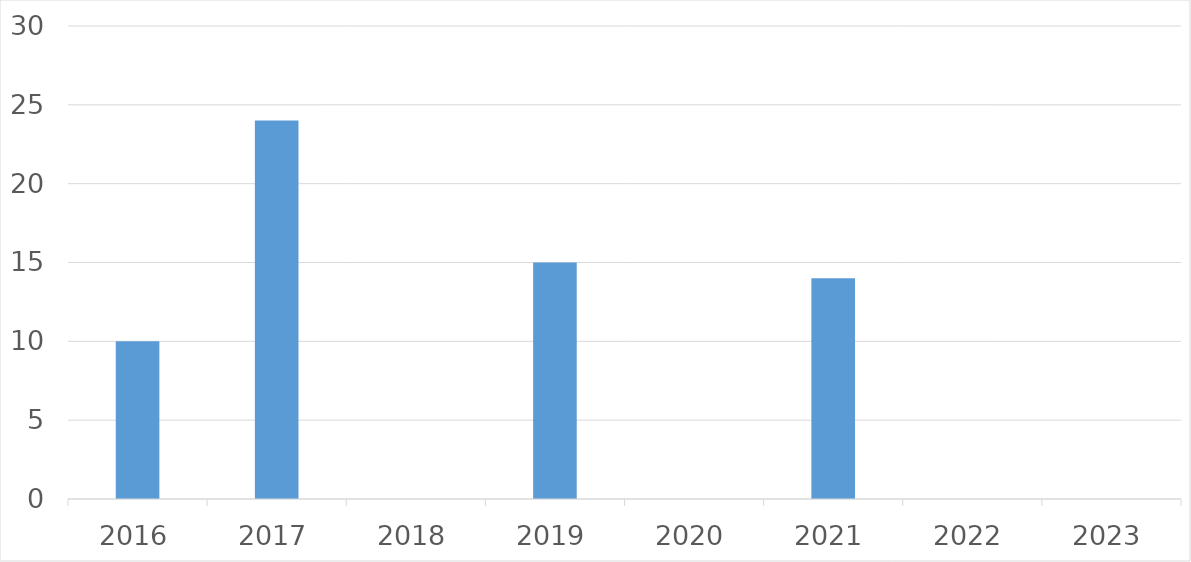
| Category | Series 0 |
|---|---|
| 2016 | 10 |
| 2017 | 24 |
| 2018 | 0 |
| 2019 | 15 |
| 2020 | 0 |
| 2021 | 14 |
| 2022 | 0 |
| 2023 | 0 |